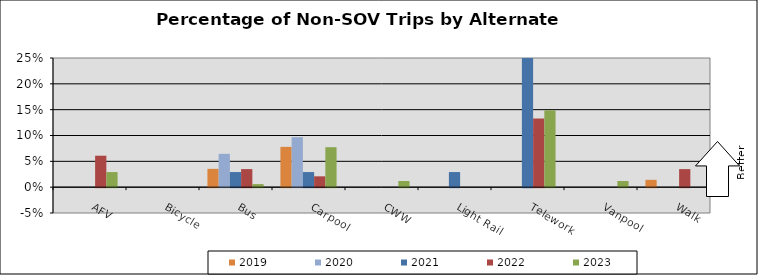
| Category | 2019 | 2020 | 2021 | 2022 | 2023 |
|---|---|---|---|---|---|
| AFV | 0 | 0 | 0 | 0.061 | 0.029 |
| Bicycle | 0 | 0 | 0 | 0 | 0 |
| Bus | 0.035 | 0.065 | 0.029 | 0.035 | 0.006 |
| Carpool | 0.078 | 0.097 | 0.029 | 0.021 | 0.077 |
| CWW | 0 | 0 | 0 | 0 | 0.012 |
| Light Rail | 0 | 0 | 0.029 | 0 | 0 |
| Telework | 0 | 0 | 0.287 | 0.133 | 0.149 |
| Vanpool | 0 | 0 | 0 | 0 | 0.012 |
| Walk | 0.014 | 0 | 0 | 0.035 | 0 |